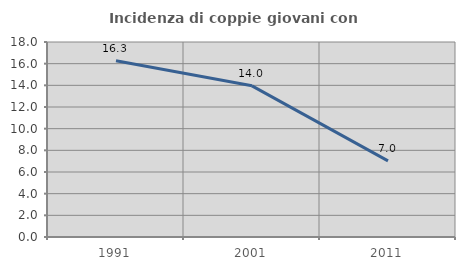
| Category | Incidenza di coppie giovani con figli |
|---|---|
| 1991.0 | 16.26 |
| 2001.0 | 13.953 |
| 2011.0 | 7.031 |